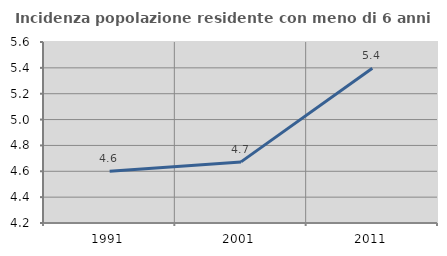
| Category | Incidenza popolazione residente con meno di 6 anni |
|---|---|
| 1991.0 | 4.6 |
| 2001.0 | 4.673 |
| 2011.0 | 5.397 |